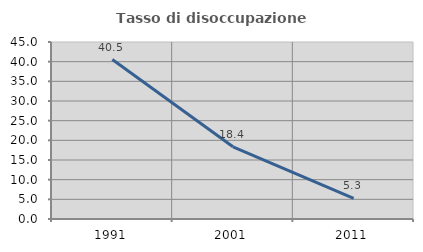
| Category | Tasso di disoccupazione giovanile  |
|---|---|
| 1991.0 | 40.541 |
| 2001.0 | 18.367 |
| 2011.0 | 5.263 |